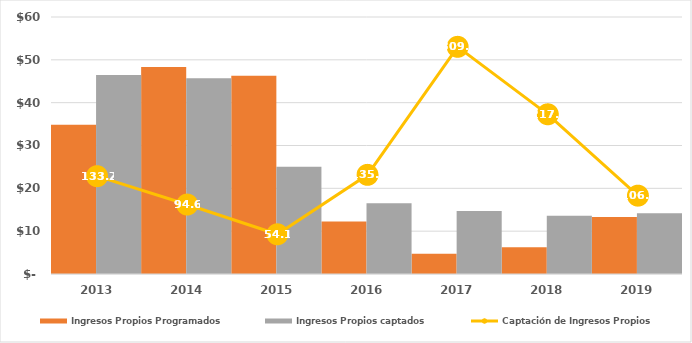
| Category | Ingresos Propios Programados | Ingresos Propios captados |
|---|---|---|
| 2013.0 | 34864.059 | 46445.785 |
| 2014.0 | 48309 | 45688 |
| 2015.0 | 46290.3 | 25037.4 |
| 2016.0 | 12228.112 | 16512.034 |
| 2017.0 | 4746.7 | 14685.3 |
| 2018.0 | 6263.7 | 13623.8 |
| 2019.0 | 13294.425 | 14184.195 |